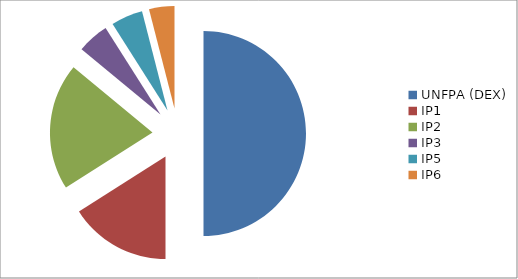
| Category | Series 0 |
|---|---|
| UNFPA (DEX) | 0.5 |
| IP1 | 0.16 |
| IP2 | 0.2 |
| IP3 | 0.05 |
| IP5 | 0.05 |
| IP6 | 0.04 |